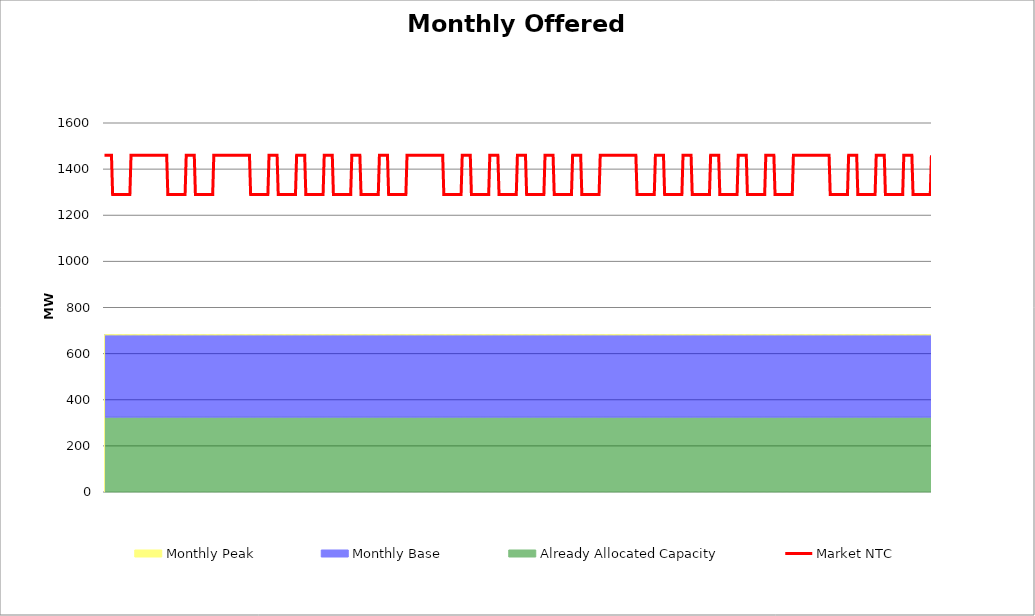
| Category | Market NTC |
|---|---|
| 0 | 1460 |
| 1 | 1460 |
| 2 | 1460 |
| 3 | 1460 |
| 4 | 1460 |
| 5 | 1460 |
| 6 | 1460 |
| 7 | 1290 |
| 8 | 1290 |
| 9 | 1290 |
| 10 | 1290 |
| 11 | 1290 |
| 12 | 1290 |
| 13 | 1290 |
| 14 | 1290 |
| 15 | 1290 |
| 16 | 1290 |
| 17 | 1290 |
| 18 | 1290 |
| 19 | 1290 |
| 20 | 1290 |
| 21 | 1290 |
| 22 | 1290 |
| 23 | 1460 |
| 24 | 1460 |
| 25 | 1460 |
| 26 | 1460 |
| 27 | 1460 |
| 28 | 1460 |
| 29 | 1460 |
| 30 | 1460 |
| 31 | 1460 |
| 32 | 1460 |
| 33 | 1460 |
| 34 | 1460 |
| 35 | 1460 |
| 36 | 1460 |
| 37 | 1460 |
| 38 | 1460 |
| 39 | 1460 |
| 40 | 1460 |
| 41 | 1460 |
| 42 | 1460 |
| 43 | 1460 |
| 44 | 1460 |
| 45 | 1460 |
| 46 | 1460 |
| 47 | 1460 |
| 48 | 1460 |
| 49 | 1460 |
| 50 | 1460 |
| 51 | 1460 |
| 52 | 1460 |
| 53 | 1460 |
| 54 | 1460 |
| 55 | 1290 |
| 56 | 1290 |
| 57 | 1290 |
| 58 | 1290 |
| 59 | 1290 |
| 60 | 1290 |
| 61 | 1290 |
| 62 | 1290 |
| 63 | 1290 |
| 64 | 1290 |
| 65 | 1290 |
| 66 | 1290 |
| 67 | 1290 |
| 68 | 1290 |
| 69 | 1290 |
| 70 | 1290 |
| 71 | 1460 |
| 72 | 1460 |
| 73 | 1460 |
| 74 | 1460 |
| 75 | 1460 |
| 76 | 1460 |
| 77 | 1460 |
| 78 | 1460 |
| 79 | 1290 |
| 80 | 1290 |
| 81 | 1290 |
| 82 | 1290 |
| 83 | 1290 |
| 84 | 1290 |
| 85 | 1290 |
| 86 | 1290 |
| 87 | 1290 |
| 88 | 1290 |
| 89 | 1290 |
| 90 | 1290 |
| 91 | 1290 |
| 92 | 1290 |
| 93 | 1290 |
| 94 | 1290 |
| 95 | 1460 |
| 96 | 1460 |
| 97 | 1460 |
| 98 | 1460 |
| 99 | 1460 |
| 100 | 1460 |
| 101 | 1460 |
| 102 | 1460 |
| 103 | 1460 |
| 104 | 1460 |
| 105 | 1460 |
| 106 | 1460 |
| 107 | 1460 |
| 108 | 1460 |
| 109 | 1460 |
| 110 | 1460 |
| 111 | 1460 |
| 112 | 1460 |
| 113 | 1460 |
| 114 | 1460 |
| 115 | 1460 |
| 116 | 1460 |
| 117 | 1460 |
| 118 | 1460 |
| 119 | 1460 |
| 120 | 1460 |
| 121 | 1460 |
| 122 | 1460 |
| 123 | 1460 |
| 124 | 1460 |
| 125 | 1460 |
| 126 | 1460 |
| 127 | 1290 |
| 128 | 1290 |
| 129 | 1290 |
| 130 | 1290 |
| 131 | 1290 |
| 132 | 1290 |
| 133 | 1290 |
| 134 | 1290 |
| 135 | 1290 |
| 136 | 1290 |
| 137 | 1290 |
| 138 | 1290 |
| 139 | 1290 |
| 140 | 1290 |
| 141 | 1290 |
| 142 | 1290 |
| 143 | 1460 |
| 144 | 1460 |
| 145 | 1460 |
| 146 | 1460 |
| 147 | 1460 |
| 148 | 1460 |
| 149 | 1460 |
| 150 | 1460 |
| 151 | 1290 |
| 152 | 1290 |
| 153 | 1290 |
| 154 | 1290 |
| 155 | 1290 |
| 156 | 1290 |
| 157 | 1290 |
| 158 | 1290 |
| 159 | 1290 |
| 160 | 1290 |
| 161 | 1290 |
| 162 | 1290 |
| 163 | 1290 |
| 164 | 1290 |
| 165 | 1290 |
| 166 | 1290 |
| 167 | 1460 |
| 168 | 1460 |
| 169 | 1460 |
| 170 | 1460 |
| 171 | 1460 |
| 172 | 1460 |
| 173 | 1460 |
| 174 | 1460 |
| 175 | 1290 |
| 176 | 1290 |
| 177 | 1290 |
| 178 | 1290 |
| 179 | 1290 |
| 180 | 1290 |
| 181 | 1290 |
| 182 | 1290 |
| 183 | 1290 |
| 184 | 1290 |
| 185 | 1290 |
| 186 | 1290 |
| 187 | 1290 |
| 188 | 1290 |
| 189 | 1290 |
| 190 | 1290 |
| 191 | 1460 |
| 192 | 1460 |
| 193 | 1460 |
| 194 | 1460 |
| 195 | 1460 |
| 196 | 1460 |
| 197 | 1460 |
| 198 | 1460 |
| 199 | 1290 |
| 200 | 1290 |
| 201 | 1290 |
| 202 | 1290 |
| 203 | 1290 |
| 204 | 1290 |
| 205 | 1290 |
| 206 | 1290 |
| 207 | 1290 |
| 208 | 1290 |
| 209 | 1290 |
| 210 | 1290 |
| 211 | 1290 |
| 212 | 1290 |
| 213 | 1290 |
| 214 | 1290 |
| 215 | 1460 |
| 216 | 1460 |
| 217 | 1460 |
| 218 | 1460 |
| 219 | 1460 |
| 220 | 1460 |
| 221 | 1460 |
| 222 | 1460 |
| 223 | 1290 |
| 224 | 1290 |
| 225 | 1290 |
| 226 | 1290 |
| 227 | 1290 |
| 228 | 1290 |
| 229 | 1290 |
| 230 | 1290 |
| 231 | 1290 |
| 232 | 1290 |
| 233 | 1290 |
| 234 | 1290 |
| 235 | 1290 |
| 236 | 1290 |
| 237 | 1290 |
| 238 | 1290 |
| 239 | 1460 |
| 240 | 1460 |
| 241 | 1460 |
| 242 | 1460 |
| 243 | 1460 |
| 244 | 1460 |
| 245 | 1460 |
| 246 | 1460 |
| 247 | 1290 |
| 248 | 1290 |
| 249 | 1290 |
| 250 | 1290 |
| 251 | 1290 |
| 252 | 1290 |
| 253 | 1290 |
| 254 | 1290 |
| 255 | 1290 |
| 256 | 1290 |
| 257 | 1290 |
| 258 | 1290 |
| 259 | 1290 |
| 260 | 1290 |
| 261 | 1290 |
| 262 | 1290 |
| 263 | 1460 |
| 264 | 1460 |
| 265 | 1460 |
| 266 | 1460 |
| 267 | 1460 |
| 268 | 1460 |
| 269 | 1460 |
| 270 | 1460 |
| 271 | 1460 |
| 272 | 1460 |
| 273 | 1460 |
| 274 | 1460 |
| 275 | 1460 |
| 276 | 1460 |
| 277 | 1460 |
| 278 | 1460 |
| 279 | 1460 |
| 280 | 1460 |
| 281 | 1460 |
| 282 | 1460 |
| 283 | 1460 |
| 284 | 1460 |
| 285 | 1460 |
| 286 | 1460 |
| 287 | 1460 |
| 288 | 1460 |
| 289 | 1460 |
| 290 | 1460 |
| 291 | 1460 |
| 292 | 1460 |
| 293 | 1460 |
| 294 | 1460 |
| 295 | 1290 |
| 296 | 1290 |
| 297 | 1290 |
| 298 | 1290 |
| 299 | 1290 |
| 300 | 1290 |
| 301 | 1290 |
| 302 | 1290 |
| 303 | 1290 |
| 304 | 1290 |
| 305 | 1290 |
| 306 | 1290 |
| 307 | 1290 |
| 308 | 1290 |
| 309 | 1290 |
| 310 | 1290 |
| 311 | 1460 |
| 312 | 1460 |
| 313 | 1460 |
| 314 | 1460 |
| 315 | 1460 |
| 316 | 1460 |
| 317 | 1460 |
| 318 | 1460 |
| 319 | 1290 |
| 320 | 1290 |
| 321 | 1290 |
| 322 | 1290 |
| 323 | 1290 |
| 324 | 1290 |
| 325 | 1290 |
| 326 | 1290 |
| 327 | 1290 |
| 328 | 1290 |
| 329 | 1290 |
| 330 | 1290 |
| 331 | 1290 |
| 332 | 1290 |
| 333 | 1290 |
| 334 | 1290 |
| 335 | 1460 |
| 336 | 1460 |
| 337 | 1460 |
| 338 | 1460 |
| 339 | 1460 |
| 340 | 1460 |
| 341 | 1460 |
| 342 | 1460 |
| 343 | 1290 |
| 344 | 1290 |
| 345 | 1290 |
| 346 | 1290 |
| 347 | 1290 |
| 348 | 1290 |
| 349 | 1290 |
| 350 | 1290 |
| 351 | 1290 |
| 352 | 1290 |
| 353 | 1290 |
| 354 | 1290 |
| 355 | 1290 |
| 356 | 1290 |
| 357 | 1290 |
| 358 | 1290 |
| 359 | 1460 |
| 360 | 1460 |
| 361 | 1460 |
| 362 | 1460 |
| 363 | 1460 |
| 364 | 1460 |
| 365 | 1460 |
| 366 | 1460 |
| 367 | 1290 |
| 368 | 1290 |
| 369 | 1290 |
| 370 | 1290 |
| 371 | 1290 |
| 372 | 1290 |
| 373 | 1290 |
| 374 | 1290 |
| 375 | 1290 |
| 376 | 1290 |
| 377 | 1290 |
| 378 | 1290 |
| 379 | 1290 |
| 380 | 1290 |
| 381 | 1290 |
| 382 | 1290 |
| 383 | 1460 |
| 384 | 1460 |
| 385 | 1460 |
| 386 | 1460 |
| 387 | 1460 |
| 388 | 1460 |
| 389 | 1460 |
| 390 | 1460 |
| 391 | 1290 |
| 392 | 1290 |
| 393 | 1290 |
| 394 | 1290 |
| 395 | 1290 |
| 396 | 1290 |
| 397 | 1290 |
| 398 | 1290 |
| 399 | 1290 |
| 400 | 1290 |
| 401 | 1290 |
| 402 | 1290 |
| 403 | 1290 |
| 404 | 1290 |
| 405 | 1290 |
| 406 | 1290 |
| 407 | 1460 |
| 408 | 1460 |
| 409 | 1460 |
| 410 | 1460 |
| 411 | 1460 |
| 412 | 1460 |
| 413 | 1460 |
| 414 | 1460 |
| 415 | 1290 |
| 416 | 1290 |
| 417 | 1290 |
| 418 | 1290 |
| 419 | 1290 |
| 420 | 1290 |
| 421 | 1290 |
| 422 | 1290 |
| 423 | 1290 |
| 424 | 1290 |
| 425 | 1290 |
| 426 | 1290 |
| 427 | 1290 |
| 428 | 1290 |
| 429 | 1290 |
| 430 | 1290 |
| 431 | 1460 |
| 432 | 1460 |
| 433 | 1460 |
| 434 | 1460 |
| 435 | 1460 |
| 436 | 1460 |
| 437 | 1460 |
| 438 | 1460 |
| 439 | 1460 |
| 440 | 1460 |
| 441 | 1460 |
| 442 | 1460 |
| 443 | 1460 |
| 444 | 1460 |
| 445 | 1460 |
| 446 | 1460 |
| 447 | 1460 |
| 448 | 1460 |
| 449 | 1460 |
| 450 | 1460 |
| 451 | 1460 |
| 452 | 1460 |
| 453 | 1460 |
| 454 | 1460 |
| 455 | 1460 |
| 456 | 1460 |
| 457 | 1460 |
| 458 | 1460 |
| 459 | 1460 |
| 460 | 1460 |
| 461 | 1460 |
| 462 | 1460 |
| 463 | 1290 |
| 464 | 1290 |
| 465 | 1290 |
| 466 | 1290 |
| 467 | 1290 |
| 468 | 1290 |
| 469 | 1290 |
| 470 | 1290 |
| 471 | 1290 |
| 472 | 1290 |
| 473 | 1290 |
| 474 | 1290 |
| 475 | 1290 |
| 476 | 1290 |
| 477 | 1290 |
| 478 | 1290 |
| 479 | 1460 |
| 480 | 1460 |
| 481 | 1460 |
| 482 | 1460 |
| 483 | 1460 |
| 484 | 1460 |
| 485 | 1460 |
| 486 | 1460 |
| 487 | 1290 |
| 488 | 1290 |
| 489 | 1290 |
| 490 | 1290 |
| 491 | 1290 |
| 492 | 1290 |
| 493 | 1290 |
| 494 | 1290 |
| 495 | 1290 |
| 496 | 1290 |
| 497 | 1290 |
| 498 | 1290 |
| 499 | 1290 |
| 500 | 1290 |
| 501 | 1290 |
| 502 | 1290 |
| 503 | 1460 |
| 504 | 1460 |
| 505 | 1460 |
| 506 | 1460 |
| 507 | 1460 |
| 508 | 1460 |
| 509 | 1460 |
| 510 | 1460 |
| 511 | 1290 |
| 512 | 1290 |
| 513 | 1290 |
| 514 | 1290 |
| 515 | 1290 |
| 516 | 1290 |
| 517 | 1290 |
| 518 | 1290 |
| 519 | 1290 |
| 520 | 1290 |
| 521 | 1290 |
| 522 | 1290 |
| 523 | 1290 |
| 524 | 1290 |
| 525 | 1290 |
| 526 | 1290 |
| 527 | 1460 |
| 528 | 1460 |
| 529 | 1460 |
| 530 | 1460 |
| 531 | 1460 |
| 532 | 1460 |
| 533 | 1460 |
| 534 | 1460 |
| 535 | 1290 |
| 536 | 1290 |
| 537 | 1290 |
| 538 | 1290 |
| 539 | 1290 |
| 540 | 1290 |
| 541 | 1290 |
| 542 | 1290 |
| 543 | 1290 |
| 544 | 1290 |
| 545 | 1290 |
| 546 | 1290 |
| 547 | 1290 |
| 548 | 1290 |
| 549 | 1290 |
| 550 | 1290 |
| 551 | 1460 |
| 552 | 1460 |
| 553 | 1460 |
| 554 | 1460 |
| 555 | 1460 |
| 556 | 1460 |
| 557 | 1460 |
| 558 | 1460 |
| 559 | 1290 |
| 560 | 1290 |
| 561 | 1290 |
| 562 | 1290 |
| 563 | 1290 |
| 564 | 1290 |
| 565 | 1290 |
| 566 | 1290 |
| 567 | 1290 |
| 568 | 1290 |
| 569 | 1290 |
| 570 | 1290 |
| 571 | 1290 |
| 572 | 1290 |
| 573 | 1290 |
| 574 | 1290 |
| 575 | 1460 |
| 576 | 1460 |
| 577 | 1460 |
| 578 | 1460 |
| 579 | 1460 |
| 580 | 1460 |
| 581 | 1460 |
| 582 | 1460 |
| 583 | 1290 |
| 584 | 1290 |
| 585 | 1290 |
| 586 | 1290 |
| 587 | 1290 |
| 588 | 1290 |
| 589 | 1290 |
| 590 | 1290 |
| 591 | 1290 |
| 592 | 1290 |
| 593 | 1290 |
| 594 | 1290 |
| 595 | 1290 |
| 596 | 1290 |
| 597 | 1290 |
| 598 | 1290 |
| 599 | 1460 |
| 600 | 1460 |
| 601 | 1460 |
| 602 | 1460 |
| 603 | 1460 |
| 604 | 1460 |
| 605 | 1460 |
| 606 | 1460 |
| 607 | 1460 |
| 608 | 1460 |
| 609 | 1460 |
| 610 | 1460 |
| 611 | 1460 |
| 612 | 1460 |
| 613 | 1460 |
| 614 | 1460 |
| 615 | 1460 |
| 616 | 1460 |
| 617 | 1460 |
| 618 | 1460 |
| 619 | 1460 |
| 620 | 1460 |
| 621 | 1460 |
| 622 | 1460 |
| 623 | 1460 |
| 624 | 1460 |
| 625 | 1460 |
| 626 | 1460 |
| 627 | 1460 |
| 628 | 1460 |
| 629 | 1460 |
| 630 | 1460 |
| 631 | 1290 |
| 632 | 1290 |
| 633 | 1290 |
| 634 | 1290 |
| 635 | 1290 |
| 636 | 1290 |
| 637 | 1290 |
| 638 | 1290 |
| 639 | 1290 |
| 640 | 1290 |
| 641 | 1290 |
| 642 | 1290 |
| 643 | 1290 |
| 644 | 1290 |
| 645 | 1290 |
| 646 | 1290 |
| 647 | 1460 |
| 648 | 1460 |
| 649 | 1460 |
| 650 | 1460 |
| 651 | 1460 |
| 652 | 1460 |
| 653 | 1460 |
| 654 | 1460 |
| 655 | 1290 |
| 656 | 1290 |
| 657 | 1290 |
| 658 | 1290 |
| 659 | 1290 |
| 660 | 1290 |
| 661 | 1290 |
| 662 | 1290 |
| 663 | 1290 |
| 664 | 1290 |
| 665 | 1290 |
| 666 | 1290 |
| 667 | 1290 |
| 668 | 1290 |
| 669 | 1290 |
| 670 | 1290 |
| 671 | 1460 |
| 672 | 1460 |
| 673 | 1460 |
| 674 | 1460 |
| 675 | 1460 |
| 676 | 1460 |
| 677 | 1460 |
| 678 | 1460 |
| 679 | 1290 |
| 680 | 1290 |
| 681 | 1290 |
| 682 | 1290 |
| 683 | 1290 |
| 684 | 1290 |
| 685 | 1290 |
| 686 | 1290 |
| 687 | 1290 |
| 688 | 1290 |
| 689 | 1290 |
| 690 | 1290 |
| 691 | 1290 |
| 692 | 1290 |
| 693 | 1290 |
| 694 | 1290 |
| 695 | 1460 |
| 696 | 1460 |
| 697 | 1460 |
| 698 | 1460 |
| 699 | 1460 |
| 700 | 1460 |
| 701 | 1460 |
| 702 | 1460 |
| 703 | 1290 |
| 704 | 1290 |
| 705 | 1290 |
| 706 | 1290 |
| 707 | 1290 |
| 708 | 1290 |
| 709 | 1290 |
| 710 | 1290 |
| 711 | 1290 |
| 712 | 1290 |
| 713 | 1290 |
| 714 | 1290 |
| 715 | 1290 |
| 716 | 1290 |
| 717 | 1290 |
| 718 | 1290 |
| 719 | 1460 |